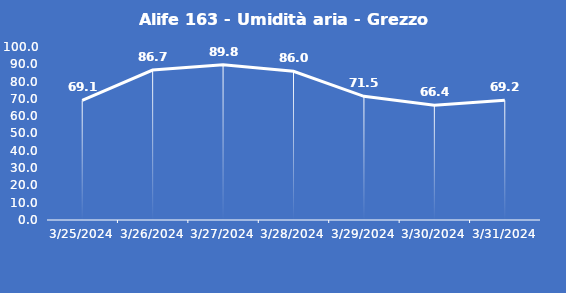
| Category | Alife 163 - Umidità aria - Grezzo (%) |
|---|---|
| 3/25/24 | 69.1 |
| 3/26/24 | 86.7 |
| 3/27/24 | 89.8 |
| 3/28/24 | 86 |
| 3/29/24 | 71.5 |
| 3/30/24 | 66.4 |
| 3/31/24 | 69.2 |